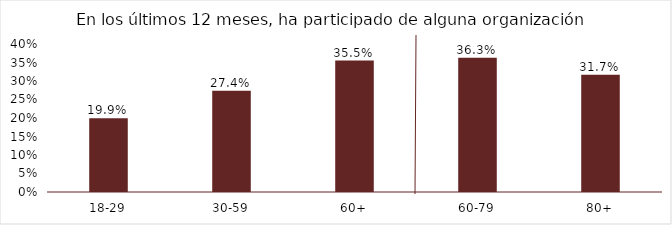
| Category | Participa |
|---|---|
| 18-29 | 0.199 |
| 30-59 | 0.274 |
| 60+ | 0.355 |
| 60-79 | 0.363 |
| 80+ | 0.317 |